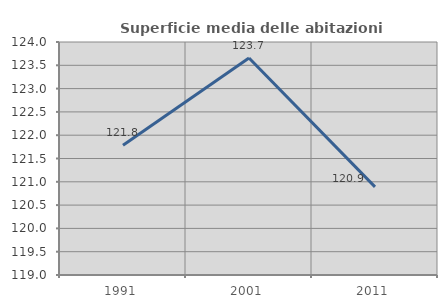
| Category | Superficie media delle abitazioni occupate |
|---|---|
| 1991.0 | 121.784 |
| 2001.0 | 123.655 |
| 2011.0 | 120.891 |